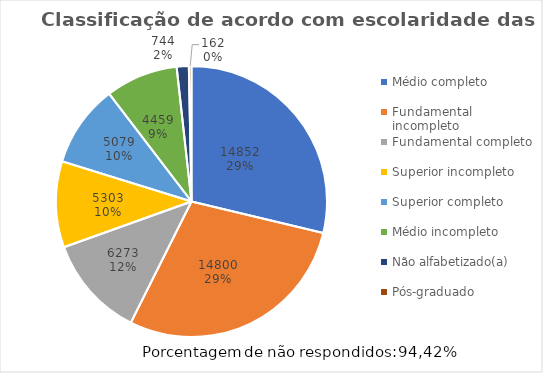
| Category | Series 0 |
|---|---|
| Médio completo            | 14852 |
| Fundamental incompleto    | 14800 |
| Fundamental completo      | 6273 |
| Superior incompleto       | 5303 |
| Superior completo         | 5079 |
| Médio incompleto          | 4459 |
| Não alfabetizado(a)       | 744 |
| Pós-graduado              | 162 |